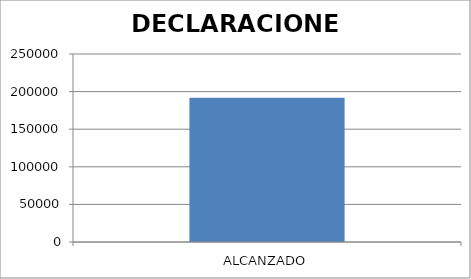
| Category | DECLARACIONES |
|---|---|
| ALCANZADO | 191914 |